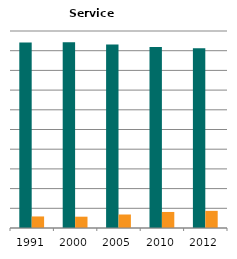
| Category | Male | Female |
|---|---|---|
| 1991.0 | 0.941 | 0.059 |
| 2000.0 | 0.943 | 0.057 |
| 2005.0 | 0.931 | 0.069 |
| 2010.0 | 0.919 | 0.081 |
| 2012.0 | 0.913 | 0.087 |